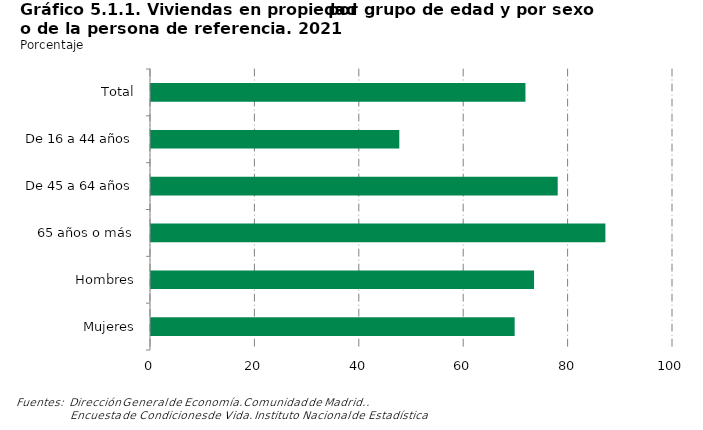
| Category | Series 0 |
|---|---|
|    Total | 71.736 |
|    De 16 a 44 años | 47.566 |
|    De 45 a 64 años | 77.915 |
|    65 años o más | 87.046 |
| Hombres | 73.386 |
| Mujeres | 69.667 |